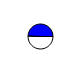
| Category | Series 0 |
|---|---|
| 0 | 4700569 |
| 1 | 4601859 |